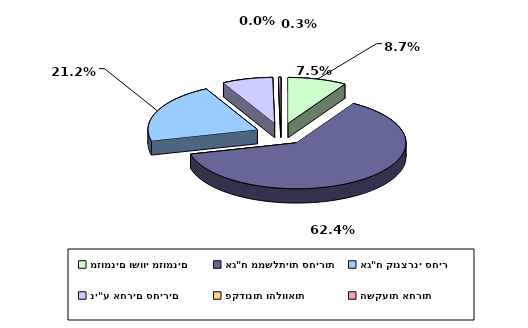
| Category | Series 0 |
|---|---|
| מזומנים ושווי מזומנים | 0.087 |
| אג"ח ממשלתיות סחירות | 0.624 |
| אג"ח קונצרני סחיר | 0.212 |
| ני"ע אחרים סחירים | 0.075 |
| פקדונות והלוואות | 0 |
| השקעות אחרות | 0.003 |